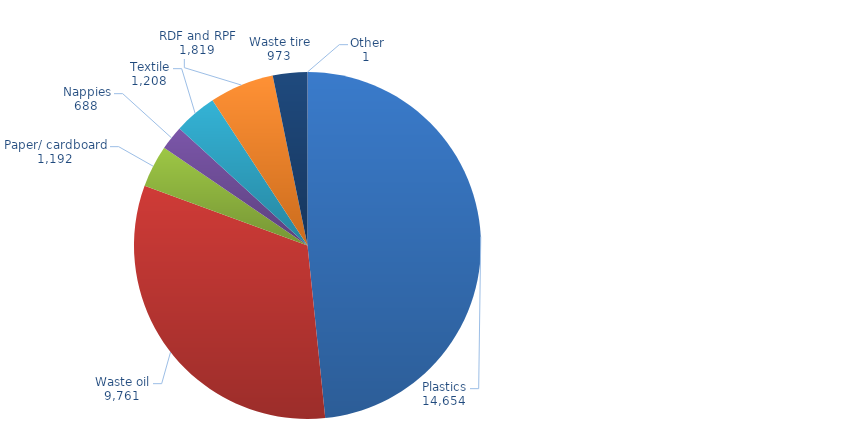
| Category | Series 0 |
|---|---|
| Plastics | 14654.404 |
| Waste oil | 9761.343 |
| Paper/ cardboard | 1191.513 |
| Nappies | 687.938 |
| Textile | 1207.925 |
| RDF and RPF | 1819.166 |
| Waste tire | 973.496 |
| Other | 1.01 |